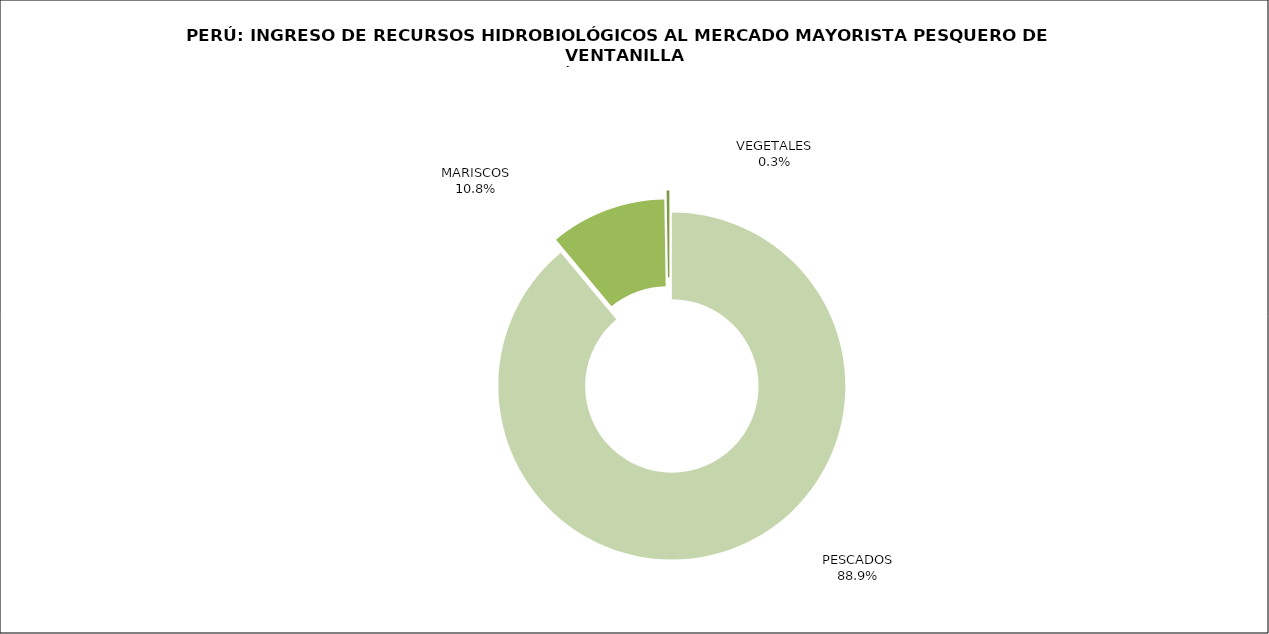
| Category | Series 0 |
|---|---|
| PESCADOS | 57594.574 |
| MARISCOS | 6993.304 |
| VEGETALES | 165.69 |